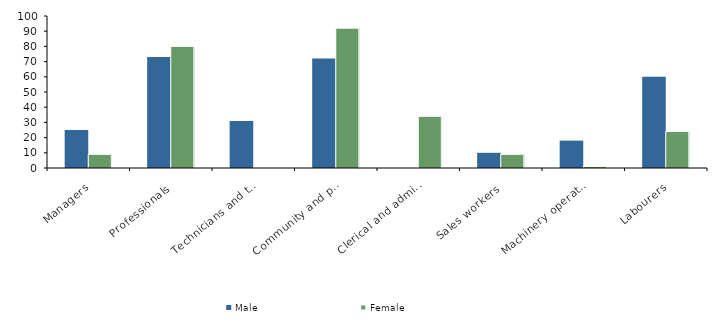
| Category | Male | Female |
|---|---|---|
| Managers | 25 | 9 |
| Professionals | 73 | 80 |
| Technicians and trades workers | 31 | 0 |
| Community and personal service workers | 72 | 92 |
| Clerical and administrative workers | 0 | 34 |
| Sales workers | 10 | 9 |
| Machinery operators and drivers | 18 | 1 |
| Labourers | 60 | 24 |